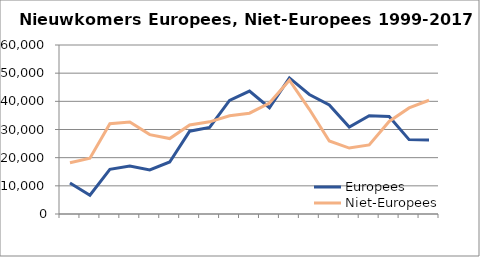
| Category | Europees | Niet-Europees |
|---|---|---|
| 0 | 11029 | 18220 |
| 1 | 6666 | 19786 |
| 2 | 15877 | 32054 |
| 3 | 17028 | 32629 |
| 4 | 15663 | 28180 |
| 5 | 18459 | 26775 |
| 6 | 29408 | 31615 |
| 7 | 30757 | 32721 |
| 8 | 40332 | 34898 |
| 9 | 43653 | 35795 |
| 10 | 37726 | 39389 |
| 11 | 48323 | 47523 |
| 12 | 42442 | 37174 |
| 13 | 38705 | 25940 |
| 14 | 30855 | 23413 |
| 15 | 34908 | 24508 |
| 16 | 34592 | 32841 |
| 17 | 26402 | 37663 |
| 18 | 26268.5 | 40386.5 |